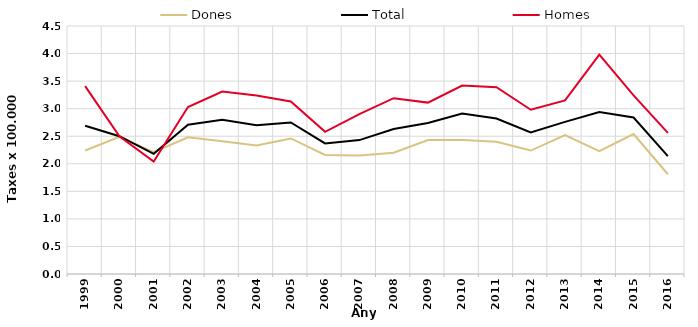
| Category | Dones | Total | Homes |
|---|---|---|---|
| 1999.0 | 2.24 | 2.69 | 3.41 |
| 2000.0 | 2.49 | 2.5 | 2.5 |
| 2001.0 | 2.21 | 2.18 | 2.04 |
| 2002.0 | 2.48 | 2.71 | 3.03 |
| 2003.0 | 2.41 | 2.8 | 3.31 |
| 2004.0 | 2.33 | 2.7 | 3.24 |
| 2005.0 | 2.46 | 2.75 | 3.13 |
| 2006.0 | 2.16 | 2.37 | 2.58 |
| 2007.0 | 2.15 | 2.43 | 2.9 |
| 2008.0 | 2.2 | 2.63 | 3.19 |
| 2009.0 | 2.43 | 2.74 | 3.11 |
| 2010.0 | 2.43 | 2.91 | 3.42 |
| 2011.0 | 2.4 | 2.82 | 3.39 |
| 2012.0 | 2.24 | 2.57 | 2.98 |
| 2013.0 | 2.52 | 2.76 | 3.15 |
| 2014.0 | 2.23 | 2.94 | 3.98 |
| 2015.0 | 2.54 | 2.84 | 3.24 |
| 2016.0 | 1.81 | 2.14 | 2.56 |